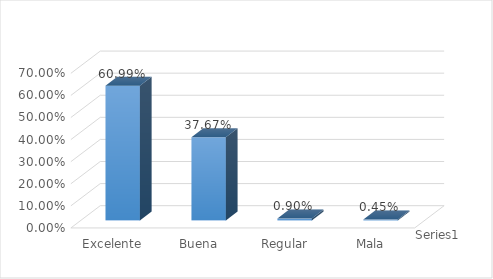
| Category | Series 0 |
|---|---|
| Excelente | 0.61 |
| Buena | 0.377 |
| Regular | 0.009 |
| Mala | 0.004 |